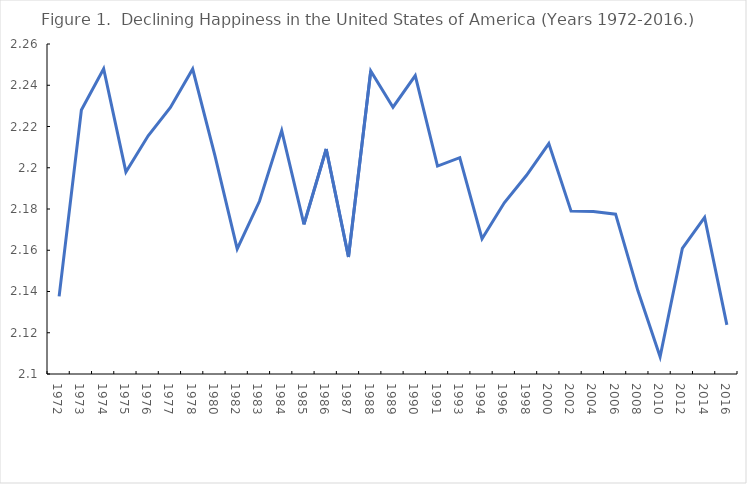
| Category | all |
|---|---|
| 1972.0 | 2.138 |
| 1973.0 | 2.228 |
| 1974.0 | 2.248 |
| 1975.0 | 2.198 |
| 1976.0 | 2.215 |
| 1977.0 | 2.229 |
| 1978.0 | 2.248 |
| 1980.0 | 2.206 |
| 1982.0 | 2.161 |
| 1983.0 | 2.184 |
| 1984.0 | 2.218 |
| 1985.0 | 2.173 |
| 1986.0 | 2.209 |
| 1987.0 | 2.157 |
| 1988.0 | 2.247 |
| 1989.0 | 2.229 |
| 1990.0 | 2.245 |
| 1991.0 | 2.201 |
| 1993.0 | 2.205 |
| 1994.0 | 2.166 |
| 1996.0 | 2.183 |
| 1998.0 | 2.196 |
| 2000.0 | 2.212 |
| 2002.0 | 2.179 |
| 2004.0 | 2.179 |
| 2006.0 | 2.177 |
| 2008.0 | 2.14 |
| 2010.0 | 2.108 |
| 2012.0 | 2.161 |
| 2014.0 | 2.176 |
| 2016.0 | 2.124 |